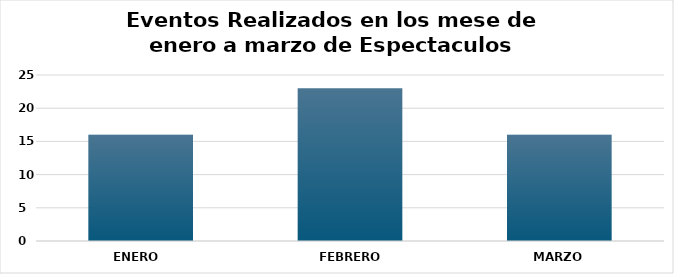
| Category | Diagrama de barras Notas  |
|---|---|
| ENERO  | 16 |
| FEBRERO  | 23 |
| MARZO | 16 |